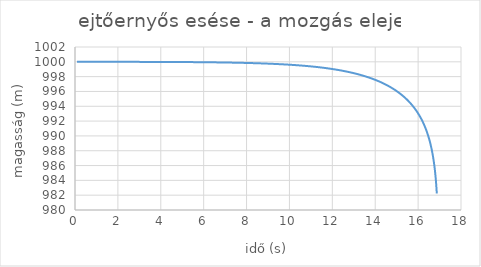
| Category | Series 0 |
|---|---|
| 0.09784999999999999 | 1000 |
| 0.19364145615175 | 1000 |
| 0.28746007160099024 | 1000 |
| 0.37938627144739057 | 1000 |
| 0.4694956294951315 | 1000 |
| 0.5578592525672859 | 1000 |
| 0.6445441273643155 | 1000 |
| 0.7296134341764717 | 1000 |
| 0.8131268311908 | 1000 |
| 0.8951407126488413 | 999.999 |
| 0.9757084436970991 | 999.999 |
| 1.0548805744175338 | 999.999 |
| 1.1327050352203816 | 999.999 |
| 1.2092273155186983 | 999.999 |
| 1.2844906273768006 | 999.999 |
| 1.358536055627824 | 999.999 |
| 1.4314026957844965 | 999.999 |
| 1.5031277809181567 | 999.998 |
| 1.5737467985508973 | 999.998 |
| 1.6432935984918067 | 999.998 |
| 1.711800492448377 | 999.998 |
| 1.7792983461563272 | 999.998 |
| 1.8458166646937435 | 999.998 |
| 1.9113836715771613 | 999.997 |
| 1.9760263821768473 | 999.997 |
| 2.0397706719350444 | 999.997 |
| 2.102641339823463 | 999.997 |
| 2.1646621674340842 | 999.996 |
| 2.225855974059738 | 999.996 |
| 2.286244668087353 | 999.996 |
| 2.345849294996809 | 999.996 |
| 2.4046900822314594 | 999.996 |
| 2.4627864811823486 | 999.995 |
| 2.520157206506535 | 999.995 |
| 2.5768202729805116 | 999.995 |
| 2.6327930300722184 | 999.994 |
| 2.688092194399391 | 999.994 |
| 2.7427338802277306 | 999.994 |
| 2.7967336281495254 | 999.994 |
| 2.850106432071698 | 999.993 |
| 2.9028667646316957 | 999.993 |
| 2.9550286011500657 | 999.993 |
| 3.006605442219837 | 999.992 |
| 3.0576103350249406 | 999.992 |
| 3.108055893472663 | 999.992 |
| 3.1579543172185853 | 999.991 |
| 3.2073174096564396 | 999.991 |
| 3.256156594939859 | 999.991 |
| 3.3044829340979707 | 999.99 |
| 3.3523071403022153 | 999.99 |
| 3.3996395933375605 | 999.989 |
| 3.4464903533274347 | 999.989 |
| 3.492869173758167 | 999.989 |
| 3.538785513845473 | 999.988 |
| 3.584248550282532 | 999.988 |
| 3.6292671884064642 | 999.987 |
| 3.6738500728174666 | 999.987 |
| 3.718005597482547 | 999.987 |
| 3.761741915353628 | 999.986 |
| 3.8050669475278034 | 999.986 |
| 3.847988391975706 | 999.985 |
| 3.890513731862215 | 999.985 |
| 3.9326502434821844 | 999.984 |
| 3.9744050038323984 | 999.984 |
| 4.015784897839612 | 999.983 |
| 4.056796625263278 | 999.983 |
| 4.0974467072904055 | 999.983 |
| 4.137741492838893 | 999.982 |
| 4.177687164584703 | 999.982 |
| 4.217289744727268 | 999.981 |
| 4.256555100506704 | 999.981 |
| 4.295488949485525 | 999.98 |
| 4.334096864606866 | 999.98 |
| 4.372384279040466 | 999.979 |
| 4.410356490827024 | 999.979 |
| 4.448018667330931 | 999.978 |
| 4.485375849510802 | 999.977 |
| 4.5224329560166785 | 999.977 |
| 4.559194787122312 | 999.976 |
| 4.595666028500412 | 999.976 |
| 4.6318512548483595 | 999.975 |
| 4.667754933371428 | 999.975 |
| 4.7033814271302 | 999.974 |
| 4.738734998258487 | 999.974 |
| 4.7738198110577255 | 999.973 |
| 4.8086399349735 | 999.972 |
| 4.8431993474595565 | 999.972 |
| 4.877501936734366 | 999.971 |
| 4.911551504435054 | 999.971 |
| 4.945351768173247 | 999.97 |
| 4.978906363997165 | 999.969 |
| 5.012218848764056 | 999.969 |
| 5.045292702426871 | 999.968 |
| 5.078131330238877 | 999.968 |
| 5.110738064879715 | 999.967 |
| 5.1431161685062525 | 999.966 |
| 5.1752688347313915 | 999.966 |
| 5.207199190533862 | 999.965 |
| 5.238910298101869 | 999.964 |
| 5.2704051566133225 | 999.964 |
| 5.3016867039552595 | 999.963 |
| 5.3327578183849305 | 999.962 |
| 5.363621320134916 | 999.962 |
| 5.394279972964526 | 999.961 |
| 5.424736485659616 | 999.96 |
| 5.454993513482882 | 999.96 |
| 5.485053659576573 | 999.959 |
| 5.514919476319491 | 999.958 |
| 5.544593466640057 | 999.957 |
| 5.574078085287134 | 999.957 |
| 5.603375740060234 | 999.956 |
| 5.632488793000665 | 999.955 |
| 5.6614195615450775 | 999.955 |
| 5.690170319642856 | 999.954 |
| 5.7187432988386835 | 999.953 |
| 5.747140689321586 | 999.952 |
| 5.775364640941701 | 999.952 |
| 5.803417264195939 | 999.951 |
| 5.831300631183693 | 999.95 |
| 5.859016776533669 | 999.949 |
| 5.88656769830289 | 999.948 |
| 5.913955358848857 | 999.948 |
| 5.941181685675842 | 999.947 |
| 5.968248572256213 | 999.946 |
| 5.995157878827681 | 999.945 |
| 6.021911433167304 | 999.945 |
| 6.048511031343069 | 999.944 |
| 6.074958438443812 | 999.943 |
| 6.101255389288232 | 999.942 |
| 6.127403589113718 | 999.941 |
| 6.15340471424566 | 999.94 |
| 6.1792604127479205 | 999.94 |
| 6.204972305055088 | 999.939 |
| 6.230541984587132 | 999.938 |
| 6.255971018347037 | 999.937 |
| 6.281260947501981 | 999.936 |
| 6.306413287948599 | 999.935 |
| 6.331429530862855 | 999.934 |
| 6.35631114323502 | 999.934 |
| 6.38105956839024 | 999.933 |
| 6.405676226495154 | 999.932 |
| 6.4301625150510135 | 999.931 |
| 6.454519809373731 | 999.93 |
| 6.478749463061272 | 999.929 |
| 6.502852808448782 | 999.928 |
| 6.526831157051854 | 999.927 |
| 6.550685799998272 | 999.926 |
| 6.574418008448625 | 999.925 |
| 6.598029034006108 | 999.925 |
| 6.621520109115852 | 999.924 |
| 6.6448924474541045 | 999.923 |
| 6.668147244307566 | 999.922 |
| 6.691285676943173 | 999.921 |
| 6.714308904968638 | 999.92 |
| 6.737218070683987 | 999.919 |
| 6.760014299424399 | 999.918 |
| 6.78269869989458 | 999.917 |
| 6.805272364494934 | 999.916 |
| 6.827736369639763 | 999.915 |
| 6.85009177606774 | 999.914 |
| 6.872339629144864 | 999.913 |
| 6.894480959160132 | 999.912 |
| 6.916516781614121 | 999.911 |
| 6.938448097500691 | 999.91 |
| 6.960275893582016 | 999.909 |
| 6.982001142657099 | 999.908 |
| 7.003624803824 | 999.907 |
| 7.025147822735911 | 999.906 |
| 7.046571131851285 | 999.905 |
| 7.067895650678152 | 999.904 |
| 7.0891222860128185 | 999.903 |
| 7.110251932173068 | 999.902 |
| 7.131285471226049 | 999.901 |
| 7.152223773210964 | 999.9 |
| 7.173067696356725 | 999.899 |
| 7.1938180872947 | 999.898 |
| 7.214475781266683 | 999.897 |
| 7.235041602328219 | 999.895 |
| 7.25551636354741 | 999.894 |
| 7.2759008671993115 | 999.893 |
| 7.296195904956052 | 999.892 |
| 7.316402258072775 | 999.891 |
| 7.336520697569519 | 999.89 |
| 7.3565519844091405 | 999.889 |
| 7.376496869671387 | 999.888 |
| 7.396356094723207 | 999.887 |
| 7.416130391385414 | 999.885 |
| 7.435820482095775 | 999.884 |
| 7.455427080068642 | 999.883 |
| 7.47495088945118 | 999.882 |
| 7.4943926054763175 | 999.881 |
| 7.513752914612466 | 999.88 |
| 7.533032494710114 | 999.879 |
| 7.552232015145365 | 999.877 |
| 7.57135213696049 | 999.876 |
| 7.590393513001584 | 999.875 |
| 7.609356788053379 | 999.874 |
| 7.628242598971302 | 999.873 |
| 7.647051574810829 | 999.872 |
| 7.665784336954218 | 999.87 |
| 7.684441499234663 | 999.869 |
| 7.7030236680579565 | 999.868 |
| 7.721531442521701 | 999.867 |
| 7.739965414532137 | 999.866 |
| 7.758326168918645 | 999.864 |
| 7.776614283545969 | 999.863 |
| 7.794830329424233 | 999.862 |
| 7.8129748708167766 | 999.861 |
| 7.831048465345888 | 999.859 |
| 7.849051664096465 | 999.858 |
| 7.86698501171766 | 999.857 |
| 7.884849046522558 | 999.856 |
| 7.902644300585923 | 999.854 |
| 7.92037129984007 | 999.853 |
| 7.938030564168904 | 999.852 |
| 7.955622607500149 | 999.851 |
| 7.973147937895843 | 999.849 |
| 7.990607057641102 | 999.848 |
| 8.008000463331223 | 999.847 |
| 8.025328645957137 | 999.845 |
| 8.042592090989269 | 999.844 |
| 8.059791278459835 | 999.843 |
| 8.076926683043606 | 999.842 |
| 8.093998774137173 | 999.84 |
| 8.111008015936756 | 999.839 |
| 8.12795486751458 | 999.838 |
| 8.144839782893852 | 999.836 |
| 8.161663211122372 | 999.835 |
| 8.1784255963448 | 999.834 |
| 8.195127377873622 | 999.832 |
| 8.211768990258829 | 999.831 |
| 8.228350863356345 | 999.829 |
| 8.244873422395232 | 999.828 |
| 8.261337088043685 | 999.827 |
| 8.277742276473866 | 999.825 |
| 8.294089399425582 | 999.824 |
| 8.310378864268834 | 999.823 |
| 8.326611074065278 | 999.821 |
| 8.34278642762859 | 999.82 |
| 8.358905319583796 | 999.818 |
| 8.374968140425548 | 999.817 |
| 8.390975276575404 | 999.816 |
| 8.406927110438112 | 999.814 |
| 8.422824020456925 | 999.813 |
| 8.438666381167964 | 999.811 |
| 8.454454563253648 | 999.81 |
| 8.47018893359522 | 999.808 |
| 8.48586985532437 | 999.807 |
| 8.501497687874002 | 999.806 |
| 8.51707278702811 | 999.804 |
| 8.532595504970859 | 999.803 |
| 8.548066190334797 | 999.801 |
| 8.563485188248302 | 999.8 |
| 8.57885284038221 | 999.798 |
| 8.594169484995676 | 999.797 |
| 8.609435456981291 | 999.795 |
| 8.624651087909431 | 999.794 |
| 8.639816706071892 | 999.792 |
| 8.65493263652481 | 999.791 |
| 8.669999201130873 | 999.789 |
| 8.685016718600847 | 999.788 |
| 8.699985504534439 | 999.786 |
| 8.714905871460482 | 999.785 |
| 8.729778128876488 | 999.783 |
| 8.74460258328755 | 999.782 |
| 8.75937953824464 | 999.78 |
| 8.774109294382278 | 999.779 |
| 8.788792149455608 | 999.777 |
| 8.80342839837689 | 999.776 |
| 8.81801833325141 | 999.774 |
| 8.832562243412825 | 999.773 |
| 8.84706041545795 | 999.771 |
| 8.861513133281006 | 999.769 |
| 8.875920678107331 | 999.768 |
| 8.890283328526564 | 999.766 |
| 8.904601360525318 | 999.765 |
| 8.918875047519336 | 999.763 |
| 8.933104660385172 | 999.761 |
| 8.947290467491369 | 999.76 |
| 8.961432734729158 | 999.758 |
| 8.9755317255427 | 999.757 |
| 8.989587700958856 | 999.755 |
| 9.003600919616513 | 999.753 |
| 9.017571637795463 | 999.752 |
| 9.03150010944484 | 999.75 |
| 9.04538658621114 | 999.749 |
| 9.059231317465816 | 999.747 |
| 9.073034550332451 | 999.745 |
| 9.086796529713547 | 999.744 |
| 9.100517498316893 | 999.742 |
| 9.114197696681558 | 999.74 |
| 9.127837363203488 | 999.739 |
| 9.141436734160738 | 999.737 |
| 9.154996043738326 | 999.735 |
| 9.168515524052719 | 999.734 |
| 9.181995405175972 | 999.732 |
| 9.195435915159505 | 999.73 |
| 9.208837280057546 | 999.729 |
| 9.22219972395022 | 999.727 |
| 9.23552346896632 | 999.725 |
| 9.248808735305737 | 999.723 |
| 9.262055741261577 | 999.722 |
| 9.275264703241959 | 999.72 |
| 9.288435835791502 | 999.718 |
| 9.3015693516125 | 999.717 |
| 9.31466546158581 | 999.715 |
| 9.327724374791428 | 999.713 |
| 9.340746298528794 | 999.711 |
| 9.35373143833679 | 999.71 |
| 9.366679998013478 | 999.708 |
| 9.379592179635539 | 999.706 |
| 9.392468183577465 | 999.704 |
| 9.405308208530473 | 999.702 |
| 9.418112451521145 | 999.701 |
| 9.430881107929833 | 999.699 |
| 9.443614371508797 | 999.697 |
| 9.456312434400086 | 999.695 |
| 9.468975487153195 | 999.694 |
| 9.481603718742457 | 999.692 |
| 9.49419731658422 | 999.69 |
| 9.506756466553767 | 999.688 |
| 9.51928135300203 | 999.686 |
| 9.531772158772059 | 999.684 |
| 9.544229065215275 | 999.683 |
| 9.556652252207513 | 999.681 |
| 9.569041898164835 | 999.679 |
| 9.581398180059143 | 999.677 |
| 9.593721273433573 | 999.675 |
| 9.606011352417696 | 999.673 |
| 9.618268589742504 | 999.672 |
| 9.630493156755215 | 999.67 |
| 9.64268522343386 | 999.668 |
| 9.6548449584017 | 999.666 |
| 9.666972528941438 | 999.664 |
| 9.679068101009246 | 999.662 |
| 9.691131839248627 | 999.66 |
| 9.703163907004063 | 999.658 |
| 9.715164466334523 | 999.657 |
| 9.727133678026764 | 999.655 |
| 9.739071701608482 | 999.653 |
| 9.75097869536128 | 999.651 |
| 9.762854816333475 | 999.649 |
| 9.77470022035274 | 999.647 |
| 9.786515062038585 | 999.645 |
| 9.798299494814678 | 999.643 |
| 9.810053670921006 | 999.641 |
| 9.821777741425883 | 999.639 |
| 9.833471856237814 | 999.637 |
| 9.845136164117195 | 999.635 |
| 9.856770812687872 | 999.633 |
| 9.868375948448564 | 999.631 |
| 9.879951716784126 | 999.629 |
| 9.89149826197668 | 999.627 |
| 9.903015727216612 | 999.625 |
| 9.91450425461342 | 999.624 |
| 9.925963985206433 | 999.622 |
| 9.937395058975408 | 999.62 |
| 9.948797614850973 | 999.618 |
| 9.960171790724964 | 999.616 |
| 9.97151772346062 | 999.614 |
| 9.982835548902662 | 999.612 |
| 9.994125401887242 | 999.609 |
| 10.005387416251777 | 999.607 |
| 10.016621724844656 | 999.605 |
| 10.027828459534836 | 999.603 |
| 10.03900775122132 | 999.601 |
| 10.050159729842514 | 999.599 |
| 10.061284524385487 | 999.597 |
| 10.072382262895093 | 999.595 |
| 10.08345307248302 | 999.593 |
| 10.094497079336692 | 999.591 |
| 10.105514408728098 | 999.589 |
| 10.11650518502249 | 999.587 |
| 10.127469531686998 | 999.585 |
| 10.138407571299128 | 999.583 |
| 10.149319425555168 | 999.581 |
| 10.160205215278493 | 999.579 |
| 10.171065060427768 | 999.577 |
| 10.181899080105064 | 999.574 |
| 10.192707392563866 | 999.572 |
| 10.203490115217003 | 999.57 |
| 10.21424736464447 | 999.568 |
| 10.22497925660117 | 999.566 |
| 10.235685906024566 | 999.564 |
| 10.246367427042234 | 999.562 |
| 10.257023932979338 | 999.56 |
| 10.267655536366023 | 999.557 |
| 10.278262348944708 | 999.555 |
| 10.288844481677307 | 999.553 |
| 10.299402044752371 | 999.551 |
| 10.309935147592132 | 999.549 |
| 10.320443898859484 | 999.547 |
| 10.330928406464876 | 999.544 |
| 10.341388777573126 | 999.542 |
| 10.351825118610165 | 999.54 |
| 10.3622375352697 | 999.538 |
| 10.372626132519793 | 999.536 |
| 10.382991014609392 | 999.533 |
| 10.393332285074758 | 999.531 |
| 10.403650046745843 | 999.529 |
| 10.413944401752586 | 999.527 |
| 10.424215451531138 | 999.525 |
| 10.43446329683003 | 999.522 |
| 10.444688037716253 | 999.52 |
| 10.45488977358129 | 999.518 |
| 10.465068603147069 | 999.516 |
| 10.475224624471858 | 999.513 |
| 10.485357934956092 | 999.511 |
| 10.495468631348132 | 999.509 |
| 10.505556809749969 | 999.507 |
| 10.51562256562286 | 999.504 |
| 10.525665993792908 | 999.502 |
| 10.535687188456576 | 999.5 |
| 10.545686243186145 | 999.498 |
| 10.555663250935108 | 999.495 |
| 10.565618304043513 | 999.493 |
| 10.575551494243243 | 999.491 |
| 10.585462912663242 | 999.488 |
| 10.595352649834686 | 999.486 |
| 10.605220795696091 | 999.484 |
| 10.61506743959838 | 999.482 |
| 10.624892670309883 | 999.479 |
| 10.634696576021293 | 999.477 |
| 10.644479244350562 | 999.475 |
| 10.654240762347753 | 999.472 |
| 10.663981216499835 | 999.47 |
| 10.673700692735428 | 999.468 |
| 10.683399276429505 | 999.465 |
| 10.693077052408032 | 999.463 |
| 10.702734104952574 | 999.46 |
| 10.712370517804839 | 999.458 |
| 10.721986374171186 | 999.456 |
| 10.73158175672708 | 999.453 |
| 10.741156747621503 | 999.451 |
| 10.750711428481315 | 999.449 |
| 10.760245880415582 | 999.446 |
| 10.76976018401984 | 999.444 |
| 10.779254419380333 | 999.441 |
| 10.788728666078205 | 999.439 |
| 10.798183003193634 | 999.437 |
| 10.807617509309939 | 999.434 |
| 10.817032262517644 | 999.432 |
| 10.826427340418496 | 999.429 |
| 10.83580282012944 | 999.427 |
| 10.845158778286558 | 999.425 |
| 10.854495291048975 | 999.422 |
| 10.863812434102703 | 999.42 |
| 10.873110282664477 | 999.417 |
| 10.882388911485526 | 999.415 |
| 10.891648394855322 | 999.412 |
| 10.900888806605284 | 999.41 |
| 10.91011022011245 | 999.407 |
| 10.919312708303108 | 999.405 |
| 10.92849634365639 | 999.402 |
| 10.937661198207836 | 999.4 |
| 10.946807343552925 | 999.397 |
| 10.955934850850552 | 999.395 |
| 10.965043790826497 | 999.392 |
| 10.974134233776844 | 999.39 |
| 10.983206249571367 | 999.387 |
| 10.992259907656889 | 999.385 |
| 11.0012952770606 | 999.382 |
| 11.01031242639335 | 999.38 |
| 11.019311423852912 | 999.377 |
| 11.0282923372272 | 999.375 |
| 11.037255233897469 | 999.372 |
| 11.046200180841478 | 999.37 |
| 11.055127244636624 | 999.367 |
| 11.064036491463048 | 999.365 |
| 11.072927987106702 | 999.362 |
| 11.081801796962399 | 999.36 |
| 11.090657986036826 | 999.357 |
| 11.099496618951527 | 999.354 |
| 11.108317759945868 | 999.352 |
| 11.117121472879957 | 999.349 |
| 11.12590782123755 | 999.347 |
| 11.134676868128928 | 999.344 |
| 11.143428676293738 | 999.341 |
| 11.152163308103814 | 999.339 |
| 11.160880825565973 | 999.336 |
| 11.169581290324778 | 999.334 |
| 11.178264763665283 | 999.331 |
| 11.186931306515742 | 999.328 |
| 11.195580979450305 | 999.326 |
| 11.20421384269168 | 999.323 |
| 11.212829956113767 | 999.321 |
| 11.221429379244286 | 999.318 |
| 11.230012171267356 | 999.315 |
| 11.238578391026065 | 999.313 |
| 11.247128097025016 | 999.31 |
| 11.255661347432842 | 999.307 |
| 11.264178200084707 | 999.305 |
| 11.272678712484776 | 999.302 |
| 11.281162941808667 | 999.299 |
| 11.289630944905875 | 999.297 |
| 11.298082778302186 | 999.294 |
| 11.306518498202054 | 999.291 |
| 11.314938160490968 | 999.289 |
| 11.323341820737785 | 999.286 |
| 11.33172953419706 | 999.283 |
| 11.340101355811337 | 999.28 |
| 11.348457340213429 | 999.278 |
| 11.356797541728676 | 999.275 |
| 11.36512201437718 | 999.272 |
| 11.373430811876021 | 999.27 |
| 11.38172398764146 | 999.267 |
| 11.390001594791105 | 999.264 |
| 11.39826368614608 | 999.261 |
| 11.406510314233158 | 999.259 |
| 11.414741531286877 | 999.256 |
| 11.422957389251648 | 999.253 |
| 11.431157939783832 | 999.25 |
| 11.511637838884372 | 999.222 |
| 11.590642755172807 | 999.194 |
| 11.668220569414597 | 999.165 |
| 11.744416609537813 | 999.135 |
| 11.819273824472308 | 999.105 |
| 11.892832943628157 | 999.075 |
| 11.965132623433588 | 999.044 |
| 12.03620958219068 | 999.012 |
| 12.106098724365872 | 998.98 |
| 12.174833255308894 | 998.948 |
| 12.24244478728553 | 998.915 |
| 12.308963437614754 | 998.882 |
| 12.374417919617162 | 998.848 |
| 12.43883562700807 | 998.813 |
| 12.502242712303508 | 998.779 |
| 12.564664159749883 | 998.743 |
| 12.626123853236987 | 998.708 |
| 12.686644639608735 | 998.672 |
| 12.746248387745768 | 998.635 |
| 12.804956043758077 | 998.598 |
| 12.862787682593847 | 998.561 |
| 12.919762556342052 | 998.523 |
| 12.97589913948076 | 998.484 |
| 13.031215171300158 | 998.446 |
| 13.085727695708735 | 998.406 |
| 13.139453098612575 | 998.367 |
| 13.192407143041105 | 998.327 |
| 13.24460500217768 | 998.286 |
| 13.29606129043993 | 998.245 |
| 13.346790092742602 | 998.204 |
| 13.396804992064673 | 998.162 |
| 13.446119095432596 | 998.12 |
| 13.494745058422522 | 998.077 |
| 13.54269510827627 | 998.034 |
| 13.58998106571837 | 997.991 |
| 13.636614365554884 | 997.947 |
| 13.68260607612858 | 997.903 |
| 13.727966917699538 | 997.858 |
| 13.772707279815211 | 997.813 |
| 13.816837237729423 | 997.768 |
| 13.860366567925542 | 997.722 |
| 13.903304762795313 | 997.676 |
| 13.945661044521298 | 997.629 |
| 13.987444378207684 | 997.582 |
| 14.028663484301328 | 997.535 |
| 14.069326850342152 | 997.488 |
| 14.109442742079603 | 997.44 |
| 14.14901921398956 | 997.391 |
| 14.188064119224022 | 997.343 |
| 14.226585119023948 | 997.293 |
| 14.264589691623845 | 997.244 |
| 14.302085140675045 | 997.194 |
| 14.33907860321308 | 997.144 |
| 14.375577057193144 | 997.094 |
| 14.411587328616289 | 997.043 |
| 14.447116098267792 | 996.992 |
| 14.482169908087968 | 996.941 |
| 14.516755167194624 | 996.889 |
| 14.55087815757535 | 996.837 |
| 14.584545039466898 | 996.785 |
| 14.617761856438019 | 996.732 |
| 14.650534540191272 | 996.68 |
| 14.682868915098569 | 996.626 |
| 14.714770702484461 | 996.573 |
| 14.74624552467048 | 996.519 |
| 14.777298908793162 | 996.465 |
| 14.80793629040782 | 996.411 |
| 14.838163016889474 | 996.356 |
| 14.867984350641816 | 996.301 |
| 14.89740547212457 | 996.246 |
| 14.92643148270907 | 996.191 |
| 14.955067407371422 | 996.135 |
| 14.98331819723214 | 996.08 |
| 15.011188731950753 | 996.023 |
| 15.038683821983383 | 995.967 |
| 15.065808210711005 | 995.91 |
| 15.092566576445625 | 995.854 |
| 15.118963534321326 | 995.797 |
| 15.14500363807674 | 995.739 |
| 15.17069138173521 | 995.682 |
| 15.19603120118856 | 995.624 |
| 15.221027475690134 | 995.566 |
| 15.24568452926244 | 995.508 |
| 15.270006632024495 | 995.449 |
| 15.293998001443667 | 995.391 |
| 15.31766280351662 | 995.332 |
| 15.341005153883676 | 995.273 |
| 15.364029118880696 | 995.214 |
| 15.386738716532394 | 995.155 |
| 15.409137917490755 | 995.095 |
| 15.431230645922048 | 995.035 |
| 15.45302078034573 | 994.975 |
| 15.474512154428377 | 994.915 |
| 15.495708557735563 | 994.855 |
| 15.516613736444505 | 994.794 |
| 15.537231394020072 | 994.734 |
| 15.557565191856664 | 994.673 |
| 15.57761874988829 | 994.612 |
| 15.597395647169044 | 994.551 |
| 15.616899422426066 | 994.49 |
| 15.636133574586932 | 994.428 |
| 15.655101563283324 | 994.367 |
| 15.673806809332692 | 994.305 |
| 15.692252695199535 | 994.243 |
| 15.710442565437837 | 994.181 |
| 15.728379727116062 | 994.119 |
| 15.74606745022606 | 994.057 |
| 15.763508968077138 | 993.994 |
| 15.780707477676465 | 993.932 |
| 15.797666140096888 | 993.869 |
| 15.814388080833218 | 993.806 |
| 15.830876390147898 | 993.743 |
| 15.847134123406969 | 993.68 |
| 15.863164301407151 | 993.617 |
| 15.878969910694808 | 993.554 |
| 15.894553903877501 | 993.49 |
| 15.909919199928808 | 993.427 |
| 15.925068684487014 | 993.363 |
| 15.94000521014823 | 993.3 |
| 15.954731596754478 | 993.236 |
| 15.969250631677205 | 993.172 |
| 15.983565070096706 | 993.108 |
| 15.997677635277805 | 993.044 |
| 16.011591018842232 | 992.98 |
| 16.025307881037985 | 992.915 |
| 16.03883085100602 | 992.851 |
| 16.05216252704453 | 992.786 |
| 16.06530547687111 | 992.722 |
| 16.078262237882978 | 992.657 |
| 16.09103531741552 | 992.592 |
| 16.103627192999326 | 992.528 |
| 16.11604031261587 | 992.463 |
| 16.128277094952004 | 992.398 |
| 16.14033992965341 | 992.333 |
| 16.15223117757709 | 992.268 |
| 16.163953171043016 | 992.202 |
| 16.175508214085053 | 992.137 |
| 16.18689858270118 | 992.072 |
| 16.198126525103113 | 992.006 |
| 16.209194261965376 | 991.941 |
| 16.22010398667383 | 991.875 |
| 16.230857865573757 | 991.81 |
| 16.24145803821746 | 991.744 |
| 16.251906617611436 | 991.678 |
| 16.262205690463123 | 991.613 |
| 16.272357317427215 | 991.547 |
| 16.282363533351567 | 991.481 |
| 16.292226347522664 | 991.415 |
| 16.301947743910638 | 991.349 |
| 16.311529681413845 | 991.283 |
| 16.320974094102954 | 991.217 |
| 16.330282891464545 | 991.151 |
| 16.339457958644175 | 991.084 |
| 16.348501156688908 | 991.018 |
| 16.357414322789236 | 990.952 |
| 16.366199270520422 | 990.885 |
| 16.37485779008316 | 990.819 |
| 16.383391648543576 | 990.753 |
| 16.391802590072505 | 990.686 |
| 16.40009233618401 | 990.62 |
| 16.408262585973105 | 990.553 |
| 16.41631501635265 | 990.486 |
| 16.424251282289394 | 990.42 |
| 16.43207301703906 | 990.353 |
| 16.43978183238055 | 990.286 |
| 16.447379318849123 | 990.22 |
| 16.45486704596855 | 990.153 |
| 16.462246562482242 | 990.086 |
| 16.469519396583237 | 990.019 |
| 16.4766870561431 | 989.952 |
| 16.48375102893961 | 989.885 |
| 16.490712782883293 | 989.818 |
| 16.497573766242667 | 989.751 |
| 16.50433540786826 | 989.684 |
| 16.510999117415306 | 989.617 |
| 16.517566285565092 | 989.55 |
| 16.524038284244988 | 989.483 |
| 16.530416466847036 | 989.416 |
| 16.536702168445153 | 989.349 |
| 16.542896706010865 | 989.281 |
| 16.54900137862758 | 989.214 |
| 16.555017467703365 | 989.147 |
| 16.560946237182197 | 989.08 |
| 16.56678893375367 | 989.012 |
| 16.572546787061146 | 988.945 |
| 16.578221009908315 | 988.878 |
| 16.58381279846415 | 988.81 |
| 16.589323332466257 | 988.743 |
| 16.59475377542256 | 988.676 |
| 16.600105274811362 | 988.608 |
| 16.605378962279723 | 988.541 |
| 16.610575953840158 | 988.473 |
| 16.615697350065645 | 988.406 |
| 16.620744236282935 | 988.338 |
| 16.625717682764133 | 988.271 |
| 16.63061874491657 | 988.203 |
| 16.63544846347094 | 988.136 |
| 16.64020786466768 | 988.068 |
| 16.644897960441632 | 988.001 |
| 16.649519748604945 | 987.933 |
| 16.65407421302821 | 987.865 |
| 16.658562323819847 | 987.798 |
| 16.662985037503727 | 987.73 |
| 16.667343297195032 | 987.663 |
| 16.67163803277435 | 987.595 |
| 16.67587016106 | 987.527 |
| 16.680040585978595 | 987.46 |
| 16.684150198733843 | 987.392 |
| 16.688199877973574 | 987.324 |
| 16.692190489955028 | 987.256 |
| 16.696122888708366 | 987.189 |
| 16.699997916198438 | 987.121 |
| 16.703816402484794 | 987.053 |
| 16.707579165879956 | 986.985 |
| 16.711287013105952 | 986.918 |
| 16.71494073944912 | 986.85 |
| 16.718541128913163 | 986.782 |
| 16.722088954370523 | 986.714 |
| 16.725584977712 | 986.646 |
| 16.7290299499947 | 986.578 |
| 16.73242461158827 | 986.511 |
| 16.735769692319447 | 986.443 |
| 16.739065911614922 | 986.375 |
| 16.74231397864256 | 986.307 |
| 16.745514592450924 | 986.239 |
| 16.748668442107178 | 986.171 |
| 16.751776206833338 | 986.103 |
| 16.754838556140893 | 986.035 |
| 16.75785614996382 | 985.967 |
| 16.760829638789982 | 985.9 |
| 16.76375966379092 | 985.832 |
| 16.766646856950103 | 985.764 |
| 16.76949184118955 | 985.696 |
| 16.772295230494937 | 985.628 |
| 16.775057630039143 | 985.56 |
| 16.777779636304256 | 985.492 |
| 16.780461837202058 | 985.424 |
| 16.78310481219301 | 985.356 |
| 16.78570913240373 | 985.288 |
| 16.788275360743 | 985.22 |
| 16.790804052016284 | 985.152 |
| 16.79329575303881 | 985.084 |
| 16.795751002747192 | 985.016 |
| 16.79817033230964 | 984.948 |
| 16.800554265234727 | 984.88 |
| 16.802903317478783 | 984.812 |
| 16.805217997551875 | 984.744 |
| 16.807498806622423 | 984.676 |
| 16.809746238620455 | 984.608 |
| 16.81196078033951 | 984.54 |
| 16.8141429115372 | 984.472 |
| 16.816293105034465 | 984.404 |
| 16.81841182681351 | 984.336 |
| 16.82049953611445 | 984.268 |
| 16.822556685530685 | 984.2 |
| 16.824583721102986 | 984.132 |
| 16.826581082412357 | 984.063 |
| 16.82854920267164 | 983.995 |
| 16.830488508815893 | 983.927 |
| 16.832399421591575 | 983.859 |
| 16.834282355644508 | 983.791 |
| 16.836137719606675 | 983.723 |
| 16.837965916181833 | 983.655 |
| 16.839767342229983 | 983.587 |
| 16.841542388850677 | 983.519 |
| 16.843291441465205 | 983.451 |
| 16.845014879897676 | 983.383 |
| 16.84671307845496 | 983.315 |
| 16.84838640600558 | 983.246 |
| 16.85003522605749 | 983.178 |
| 16.8516598968348 | 983.11 |
| 16.85326077135347 | 983.042 |
| 16.854838197495912 | 982.974 |
| 16.85639251808463 | 982.906 |
| 16.857924070954777 | 982.838 |
| 16.859433189025772 | 982.77 |
| 16.86092020037188 | 982.702 |
| 16.86238542829183 | 982.633 |
| 16.863829191377487 | 982.565 |
| 16.86525180358153 | 982.497 |
| 16.866653574284218 | 982.429 |
| 16.86803480835923 | 982.361 |
| 16.86939580623856 | 982.293 |
| 16.870736863976525 | 982.225 |